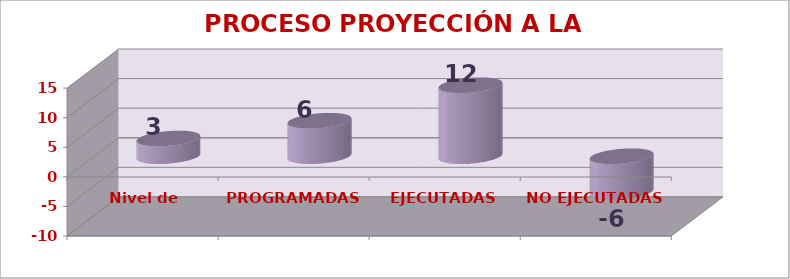
| Category | PROCESO PROYECCIÓN A LA COMUNIDAD |
|---|---|
| Nivel de satisfacción | 3 |
| PROGRAMADAS | 6 |
| EJECUTADAS | 12 |
| NO EJECUTADAS | -6 |